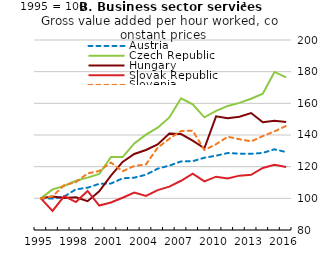
| Category | Austria | Czech Republic | Hungary | Slovak Republic | Slovenia |
|---|---|---|---|---|---|
| 1995.0 | 100 | 100 | 100 | 100 | 100 |
| 1996.0 | 99.825 | 105.666 | 101.172 | 92.093 | 101.285 |
| 1997.0 | 101.138 | 107.826 | 100.286 | 101.391 | 108.301 |
| 1998.0 | 105.673 | 111.099 | 100.695 | 97.669 | 110.22 |
| 1999.0 | 106.707 | 113.069 | 98.204 | 104.648 | 115.716 |
| 2000.0 | 109.156 | 115.378 | 104.417 | 95.454 | 117.257 |
| 2001.0 | 109.339 | 126.152 | 114.296 | 97.358 | 122.637 |
| 2002.0 | 112.653 | 126.074 | 122.982 | 100.349 | 117.102 |
| 2003.0 | 113.07 | 134.718 | 128.034 | 103.68 | 120.435 |
| 2004.0 | 114.903 | 140.264 | 130.519 | 101.543 | 121.468 |
| 2005.0 | 118.715 | 144.595 | 134.065 | 105.159 | 131.92 |
| 2006.0 | 120.674 | 151.098 | 140.87 | 107.381 | 137.653 |
| 2007.0 | 123.313 | 163.148 | 140.597 | 111.096 | 142.508 |
| 2008.0 | 123.45 | 159.34 | 136.474 | 115.546 | 142.728 |
| 2009.0 | 125.662 | 151.165 | 131.647 | 110.745 | 130.522 |
| 2010.0 | 126.911 | 155.19 | 151.776 | 113.668 | 134.19 |
| 2011.0 | 128.611 | 158.372 | 150.658 | 112.512 | 138.899 |
| 2012.0 | 128.232 | 160.282 | 151.575 | 114.334 | 137.313 |
| 2013.0 | 128.094 | 162.904 | 153.873 | 114.868 | 135.988 |
| 2014.0 | 128.691 | 166.104 | 148.034 | 119.201 | 139.308 |
| 2015.0 | 130.962 | 179.812 | 149.019 | 121.247 | 142.268 |
| 2016.0 | 129.207 | 176.355 | 148.169 | 119.773 | 145.74 |